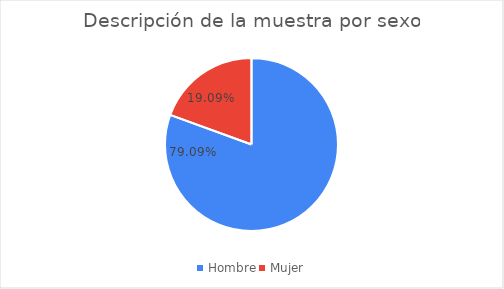
| Category | Series 0 |
|---|---|
| Hombre | 0.791 |
| Mujer | 0.191 |